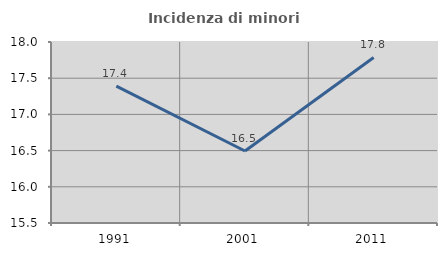
| Category | Incidenza di minori stranieri |
|---|---|
| 1991.0 | 17.391 |
| 2001.0 | 16.495 |
| 2011.0 | 17.787 |